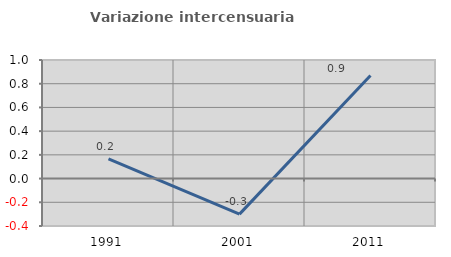
| Category | Variazione intercensuaria annua |
|---|---|
| 1991.0 | 0.166 |
| 2001.0 | -0.3 |
| 2011.0 | 0.869 |